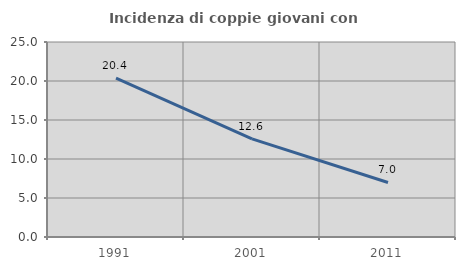
| Category | Incidenza di coppie giovani con figli |
|---|---|
| 1991.0 | 20.358 |
| 2001.0 | 12.579 |
| 2011.0 | 6.992 |